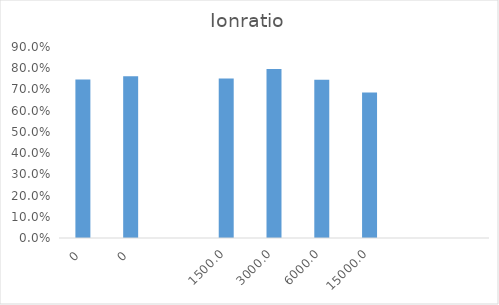
| Category | Series 0 |
|---|---|
| 0.0 | 0.747 |
| 0.0 | 0.762 |
| nan | 0 |
| 1500.0 | 0.751 |
| 3000.0 | 0.796 |
| 6000.0 | 0.746 |
| 15000.0 | 0.686 |
| nan | 0 |
| nan | 0 |